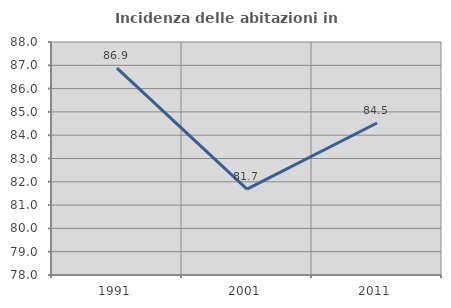
| Category | Incidenza delle abitazioni in proprietà  |
|---|---|
| 1991.0 | 86.875 |
| 2001.0 | 81.686 |
| 2011.0 | 84.524 |